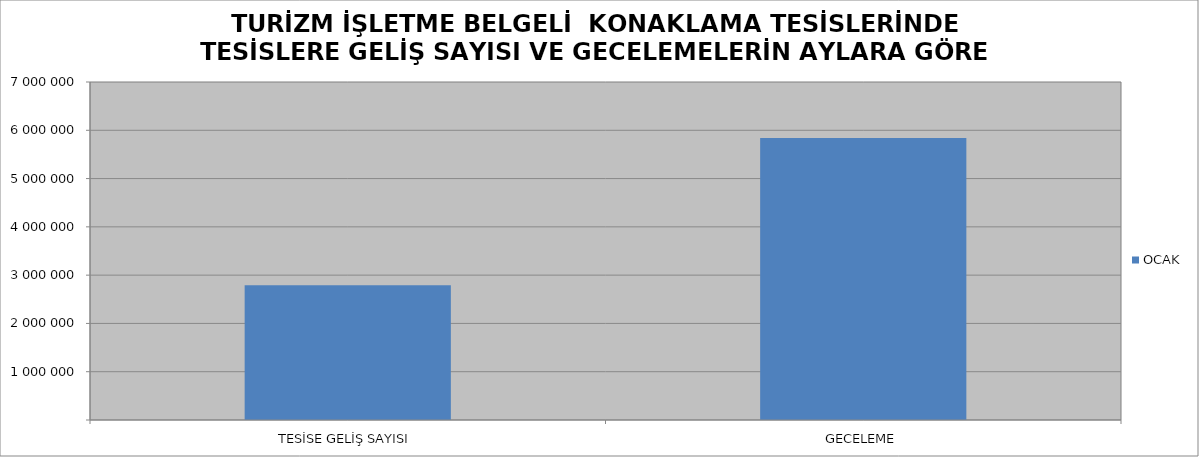
| Category | OCAK |
|---|---|
| TESİSE GELİŞ SAYISI | 2792196 |
| GECELEME | 5837753 |